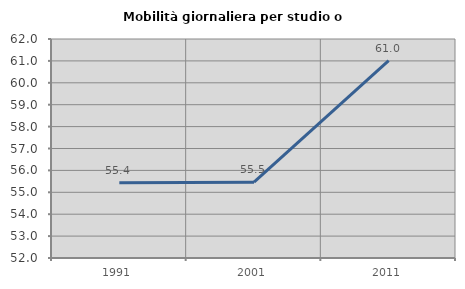
| Category | Mobilità giornaliera per studio o lavoro |
|---|---|
| 1991.0 | 55.436 |
| 2001.0 | 55.464 |
| 2011.0 | 61.016 |